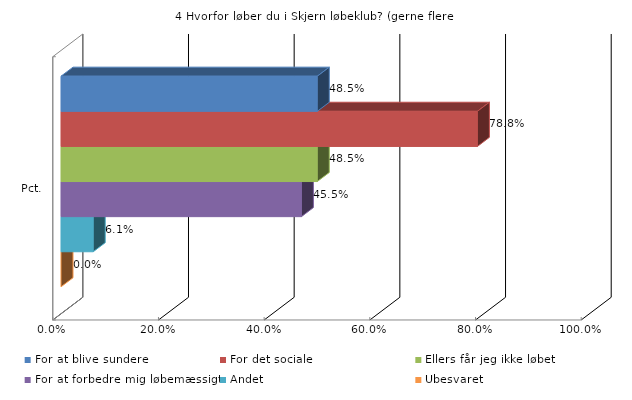
| Category | For at blive sundere | For det sociale | Ellers får jeg ikke løbet | For at forbedre mig løbemæssigt | Andet | Ubesvaret |
|---|---|---|---|---|---|---|
| Pct. | 0.485 | 0.788 | 0.485 | 0.455 | 0.061 | 0 |